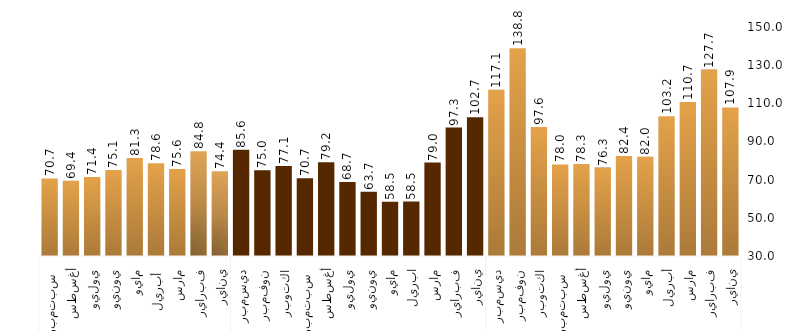
| Category | Series 0 |
|---|---|
| 0 | 107.861 |
| 1 | 127.674 |
| 2 | 110.742 |
| 3 | 103.239 |
| 4 | 82.016 |
| 5 | 82.421 |
| 6 | 76.314 |
| 7 | 78.265 |
| 8 | 77.961 |
| 9 | 97.566 |
| 10 | 138.85 |
| 11 | 117.091 |
| 12 | 102.678 |
| 13 | 97.332 |
| 14 | 78.955 |
| 15 | 58.549 |
| 16 | 58.455 |
| 17 | 63.691 |
| 18 | 68.721 |
| 19 | 79.161 |
| 20 | 70.692 |
| 21 | 77.111 |
| 22 | 74.955 |
| 23 | 85.627 |
| 24 | 74.378 |
| 25 | 84.831 |
| 26 | 75.573 |
| 27 | 78.621 |
| 28 | 81.312 |
| 29 | 75.092 |
| 30 | 71.411 |
| 31 | 69.374 |
| 32 | 70.671 |